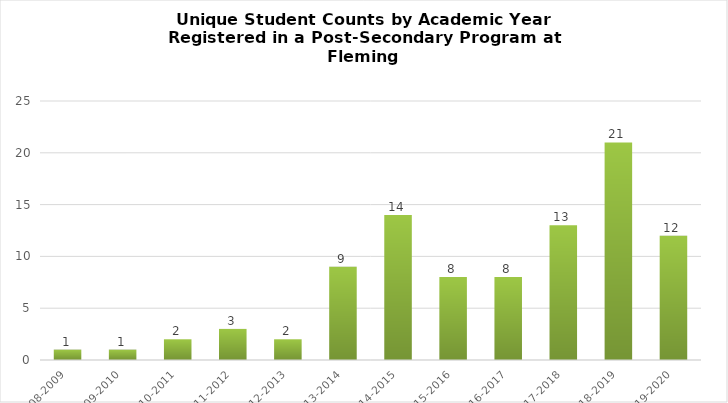
| Category | Total |
|---|---|
| 2008-2009 | 1 |
| 2009-2010 | 1 |
| 2010-2011 | 2 |
| 2011-2012 | 3 |
| 2012-2013 | 2 |
| 2013-2014 | 9 |
| 2014-2015 | 14 |
| 2015-2016 | 8 |
| 2016-2017 | 8 |
| 2017-2018 | 13 |
| 2018-2019 | 21 |
| 2019-2020 | 12 |